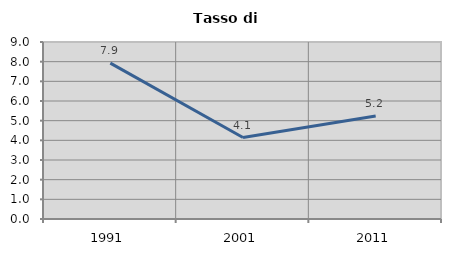
| Category | Tasso di disoccupazione   |
|---|---|
| 1991.0 | 7.927 |
| 2001.0 | 4.141 |
| 2011.0 | 5.237 |